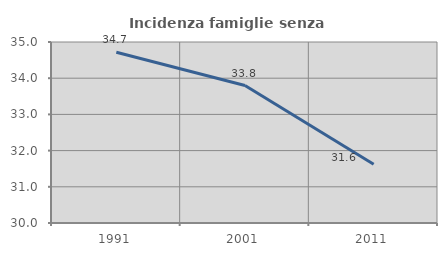
| Category | Incidenza famiglie senza nuclei |
|---|---|
| 1991.0 | 34.715 |
| 2001.0 | 33.796 |
| 2011.0 | 31.621 |